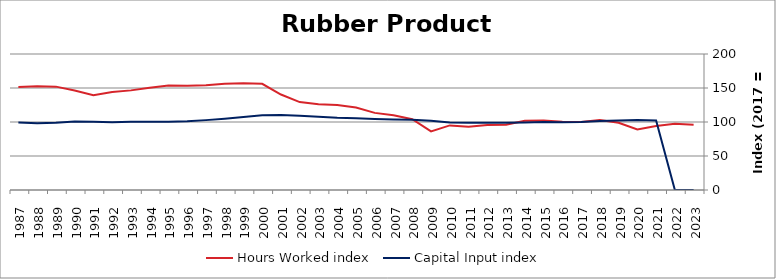
| Category | Hours Worked index | Capital Input index |
|---|---|---|
| 2023.0 | 96.009 | 0 |
| 2022.0 | 97.391 | 0 |
| 2021.0 | 94.099 | 102.295 |
| 2020.0 | 88.933 | 102.877 |
| 2019.0 | 98.876 | 102.307 |
| 2018.0 | 102.887 | 101.426 |
| 2017.0 | 100 | 100 |
| 2016.0 | 100.245 | 99.536 |
| 2015.0 | 102.038 | 99.932 |
| 2014.0 | 101.955 | 99.348 |
| 2013.0 | 96.033 | 98.799 |
| 2012.0 | 95.46 | 98.74 |
| 2011.0 | 92.929 | 98.872 |
| 2010.0 | 94.969 | 99.381 |
| 2009.0 | 86.238 | 101.894 |
| 2008.0 | 104.004 | 103.466 |
| 2007.0 | 109.91 | 103.713 |
| 2006.0 | 113.42 | 104.422 |
| 2005.0 | 121.364 | 105.583 |
| 2004.0 | 125.08 | 106.198 |
| 2003.0 | 125.954 | 107.589 |
| 2002.0 | 129.246 | 109.318 |
| 2001.0 | 140.441 | 110.473 |
| 2000.0 | 156.206 | 109.784 |
| 1999.0 | 156.964 | 107.474 |
| 1998.0 | 156.179 | 104.887 |
| 1997.0 | 154.078 | 102.761 |
| 1996.0 | 153.484 | 101.062 |
| 1995.0 | 153.66 | 100.214 |
| 1994.0 | 150.215 | 100.241 |
| 1993.0 | 146.51 | 100.211 |
| 1992.0 | 144.206 | 99.728 |
| 1991.0 | 139.255 | 100.432 |
| 1990.0 | 146.389 | 100.754 |
| 1989.0 | 152.013 | 98.989 |
| 1988.0 | 152.665 | 98.11 |
| 1987.0 | 151.608 | 99.344 |